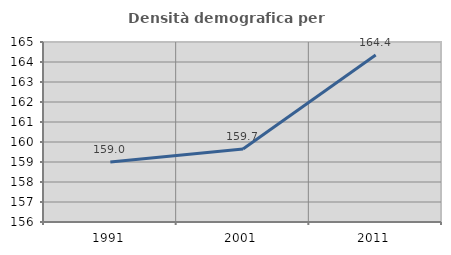
| Category | Densità demografica |
|---|---|
| 1991.0 | 158.995 |
| 2001.0 | 159.654 |
| 2011.0 | 164.355 |